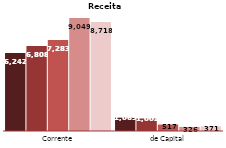
| Category | 2013 | 2014 | 2015 | 2016 | 2017 |
|---|---|---|---|---|---|
| Corrente | 6242 | 6808 | 7283 | 9049 | 8718 |
| de Capital | 1069 | 1002 | 517 | 326 | 371 |